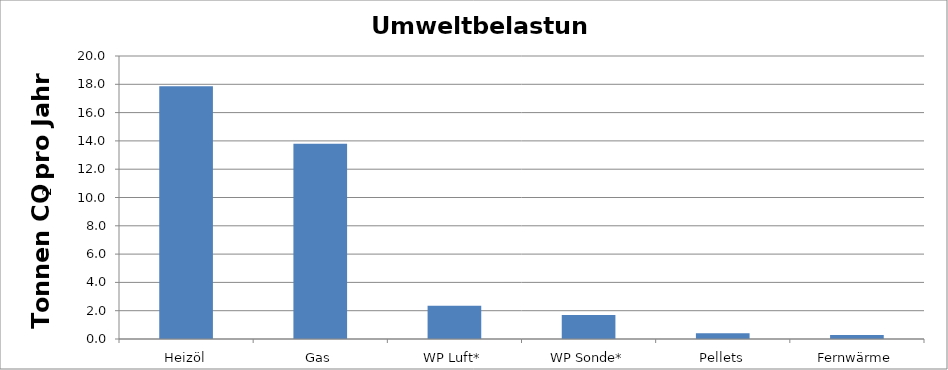
| Category | Fossiles CO2  |
|---|---|
| Heizöl | 17.862 |
| Gas | 13.8 |
| WP Luft* | 2.354 |
| WP Sonde* | 1.7 |
| Pellets | 0.413 |
| Fernwärme | 0.276 |